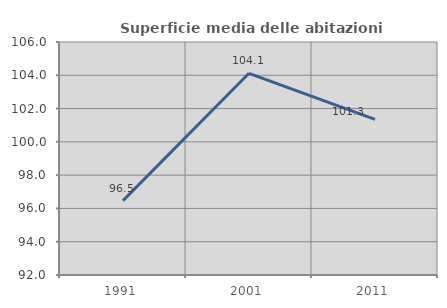
| Category | Superficie media delle abitazioni occupate |
|---|---|
| 1991.0 | 96.466 |
| 2001.0 | 104.118 |
| 2011.0 | 101.348 |